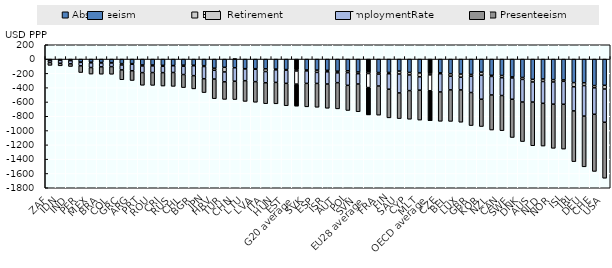
| Category | Absenteeism | EarlyRetirement | EmploymentRate | Presenteeism |
|---|---|---|---|---|
| ZAF | -19.217 | -1.563 | -26.681 | -40.803 |
| IDN | -17.257 | -1.151 | -40.04 | -36.087 |
| IND | -17.944 | -4.35 | -44.271 | -37.533 |
| PER | -43.475 | -2.398 | -49.093 | -93.568 |
| MEX | -43.823 | -9.684 | -64.765 | -91.865 |
| BRA | -48.029 | -7.129 | -53.539 | -103.129 |
| COL | -49.905 | -5.16 | -50.694 | -106.935 |
| GRC | -63.629 | -19.411 | -68.632 | -137.847 |
| ARG | -63.688 | -8.939 | -90.786 | -136.601 |
| PRT | -82.426 | -14.134 | -92.936 | -177.009 |
| ROU | -83.229 | -12.48 | -92.851 | -179.529 |
| CRI | -87.499 | -13.79 | -88.519 | -187.433 |
| RUS | -90.407 | -3.509 | -93.618 | -194.627 |
| CHL | -85.007 | -15.18 | -116.21 | -183.016 |
| BGR | -86.328 | -7.19 | -138.523 | -184.955 |
| JPN | -92.496 | -11.964 | -170.454 | -194.436 |
| HRV | -127.749 | -28.481 | -123.541 | -274.255 |
| TUR | -115.235 | -64.905 | -137.854 | -246.362 |
| CHN | -121.236 | 0.304 | -188.471 | -256.611 |
| LTU | -134.299 | -4.104 | -164.183 | -289.693 |
| LVA | -134.498 | -7.797 | -173.535 | -288.151 |
| ITA | -136.491 | -38.367 | -156.76 | -293.099 |
| HUN | -139.942 | -11.363 | -175.01 | -299.599 |
| EST | -146.61 | -8.505 | -184.539 | -313.072 |
| G20 average | -143.737 | -23.327 | -183.297 | -307.288 |
| SVK | -152.723 | -12.984 | -174.432 | -327.899 |
| ESP | -154.815 | -31.734 | -154.176 | -333.418 |
| ISR | -157.643 | -21.111 | -170.198 | -339.231 |
| AUT | -169.623 | -23.626 | -136.73 | -366.499 |
| POL | -163.885 | -26.05 | -177.511 | -351.76 |
| SVN | -180.578 | -24.565 | -143.7 | -388.106 |
| EU28 average | -177.863 | -24.879 | -195.65 | -382.226 |
| FRA | -188.457 | -22.1 | -166.329 | -407.689 |
| FIN | -187.026 | -18.757 | -215.715 | -400.754 |
| SAU | -168.18 | -41.116 | -264.479 | -359.077 |
| CYP | -186.75 | -35.646 | -218.746 | -400.58 |
| MLT | -194.272 | -54.581 | -186.069 | -418.809 |
| OECD average | -195.423 | -26.264 | -221.295 | -419.539 |
| CZE | -192.321 | -12.893 | -254.878 | -410.32 |
| BEL | -204.065 | -35.464 | -191.731 | -440.497 |
| LUX | -209.751 | -44.544 | -177.584 | -451.46 |
| GBR | -214.138 | -25.872 | -227.881 | -462.503 |
| KOR | -182.754 | -42.856 | -335.754 | -382.379 |
| NZL | -226.816 | -16.72 | -258.497 | -490.428 |
| CAN | -229.412 | -31.414 | -249.027 | -492.06 |
| SWE | -249.451 | -15.229 | -297.121 | -535.059 |
| DNK | -257.475 | -27.29 | -316.105 | -553.327 |
| AUS | -283.494 | -37.126 | -280.756 | -611.351 |
| NLD | -278.638 | -35.29 | -304.992 | -597.696 |
| NOR | -287.715 | -32.866 | -309.899 | -617.739 |
| ISL | -291.067 | -20.172 | -320.496 | -627.561 |
| IRL | -329.228 | -58.64 | -337.459 | -709.496 |
| DEU | -331.765 | -39.51 | -426.52 | -709.236 |
| CHE | -370.944 | -31.334 | -369.603 | -799.744 |
| USA | -366.972 | -51.95 | -464.651 | -783.031 |